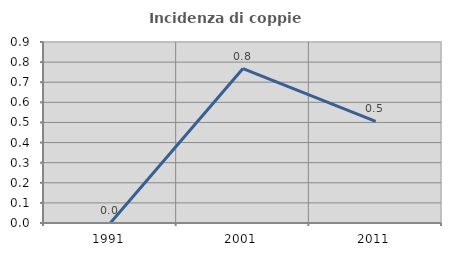
| Category | Incidenza di coppie miste |
|---|---|
| 1991.0 | 0 |
| 2001.0 | 0.768 |
| 2011.0 | 0.505 |